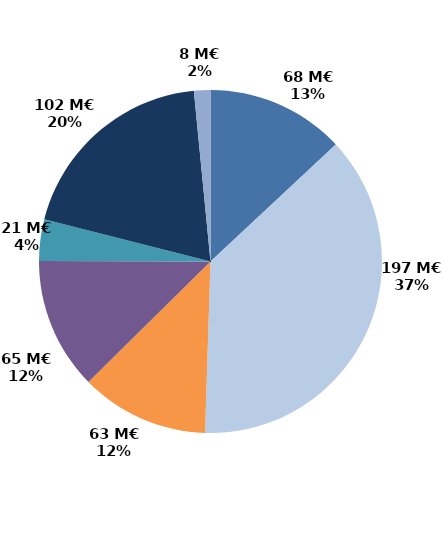
| Category | Series 0 |
|---|---|
| Accueil et information (CEP 1) | 68.417 |
| Accompagnement renforcé (CEP 2 et 3) | 196.63 |
| Suivi | 63.479 |
| Missions locales | 65.218 |
| CSP | 20.544 |
| Aide à la création d'entreprise | 102.305 |
| Aide à l'insertion | 8.131 |